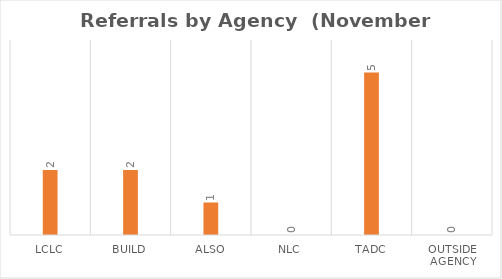
| Category | Series 0 |
|---|---|
| LCLC | 2 |
| BUILD | 2 |
| ALSO | 1 |
| NLC | 0 |
| TADC | 5 |
| Outside Agency | 0 |